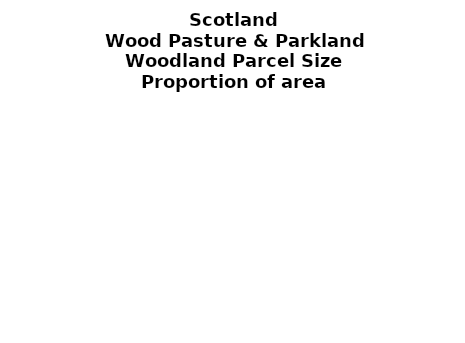
| Category | Wood Pasture & Parkland |
|---|---|
| <5 ha | 0.488 |
| ≥5 and <10 ha | 0.023 |
| ≥10 and <15 ha | 0.029 |
| ≥15 and <20 ha | 0 |
| ≥20 and <25 ha | 0 |
| ≥25 and <30 ha | 0 |
| ≥30 and <35 ha | 0 |
| ≥35 and <40 ha | 0 |
| ≥40 and <45 ha | 0 |
| ≥45 and <50 ha | 0 |
| ≥50 and <60 ha | 0.007 |
| ≥60 and <70 ha | 0 |
| ≥70 and <80 ha | 0 |
| ≥80 and <90 ha | 0.04 |
| ≥90 and <100 ha | 0 |
| ≥100 and <150 ha | 0.363 |
| ≥150 and <200 ha | 0 |
| ≥200 ha | 0.05 |